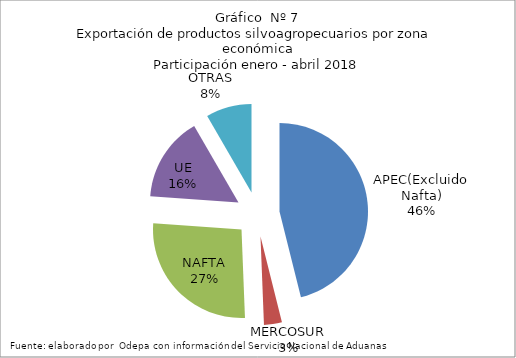
| Category | Series 0 |
|---|---|
| APEC(Excluido Nafta) | 2946042.336 |
| MERCOSUR | 208885.254 |
| NAFTA | 1709642.778 |
| UE | 991643.192 |
| OTRAS | 533442.439 |